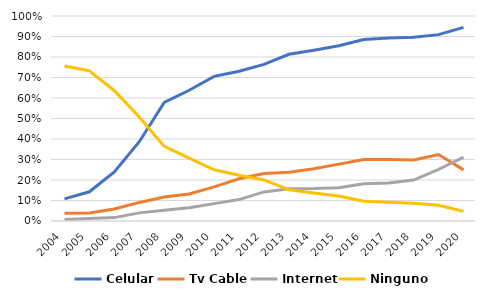
| Category | Celular | Tv Cable | Internet | Ninguno |
|---|---|---|---|---|
| 2004.0 | 0.108 | 0.038 | 0.007 | 0.756 |
| 2005.0 | 0.142 | 0.039 | 0.012 | 0.733 |
| 2006.0 | 0.239 | 0.058 | 0.017 | 0.635 |
| 2007.0 | 0.387 | 0.091 | 0.04 | 0.507 |
| 2008.0 | 0.579 | 0.117 | 0.052 | 0.364 |
| 2009.0 | 0.638 | 0.132 | 0.064 | 0.307 |
| 2010.0 | 0.706 | 0.166 | 0.085 | 0.25 |
| 2011.0 | 0.731 | 0.206 | 0.105 | 0.223 |
| 2012.0 | 0.764 | 0.231 | 0.142 | 0.2 |
| 2013.0 | 0.813 | 0.238 | 0.158 | 0.153 |
| 2014.0 | 0.833 | 0.255 | 0.159 | 0.137 |
| 2015.0 | 0.855 | 0.277 | 0.163 | 0.122 |
| 2016.0 | 0.885 | 0.299 | 0.182 | 0.096 |
| 2017.0 | 0.893 | 0.3 | 0.185 | 0.091 |
| 2018.0 | 0.897 | 0.298 | 0.2 | 0.087 |
| 2019.0 | 0.909 | 0.324 | 0.252 | 0.077 |
| 2020.0 | 0.944 | 0.249 | 0.312 | 0.047 |